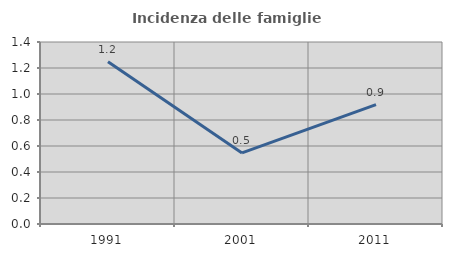
| Category | Incidenza delle famiglie numerose |
|---|---|
| 1991.0 | 1.249 |
| 2001.0 | 0.547 |
| 2011.0 | 0.918 |